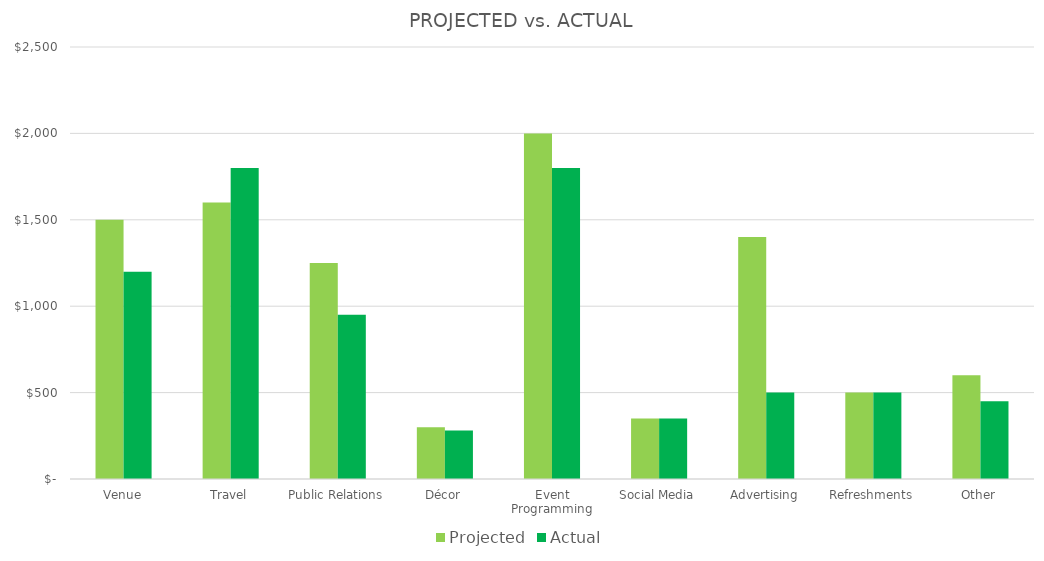
| Category | Projected | Actual |
|---|---|---|
| Venue | 1500 | 1200 |
| Travel | 1600 | 1800 |
| Public Relations | 1250 | 950 |
| Décor | 300 | 280 |
| Event Programming | 2000 | 1800 |
| Social Media | 350 | 350 |
| Advertising | 1400 | 500 |
| Refreshments | 500 | 500 |
| Other | 600 | 450 |